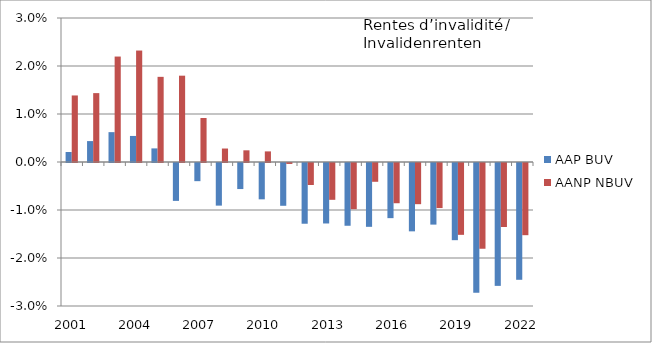
| Category | AAP | AANP |
|---|---|---|
|  2001 | 0.002 | 0.014 |
| 2002 | 0.004 | 0.014 |
| 2003 | 0.006 | 0.022 |
| 2004 | 0.005 | 0.023 |
| 2005 | 0.003 | 0.018 |
| 2006 | -0.008 | 0.018 |
| 2007 | -0.004 | 0.009 |
| 2008 | -0.009 | 0.003 |
| 2009 | -0.005 | 0.002 |
| 2010 | -0.008 | 0.002 |
| 2011 | -0.009 | 0 |
| 2012 | -0.013 | -0.005 |
| 2013 | -0.013 | -0.008 |
| 2014 | -0.013 | -0.01 |
| 2015 | -0.013 | -0.004 |
| 2016 | -0.011 | -0.008 |
| 2017 | -0.014 | -0.009 |
| 2018 | -0.013 | -0.009 |
| 2019 | -0.016 | -0.015 |
| 2020 | -0.027 | -0.018 |
| 2021 | -0.026 | -0.013 |
| 2022 | -0.024 | -0.015 |